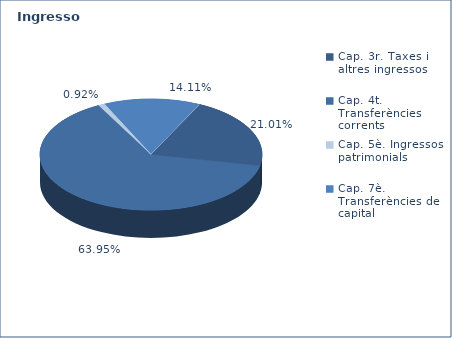
| Category | Series 0 |
|---|---|
| Cap. 3r. Taxes i altres ingressos | 66663745 |
| Cap. 4t. Transferències corrents | 202928868 |
| Cap. 5è. Ingressos patrimonials | 2932380 |
| Cap. 7è. Transferències de capital | 44787167 |
| Cap. 8è. Actius financers | 0 |
| Cap. 9è. Préstecs | 0 |